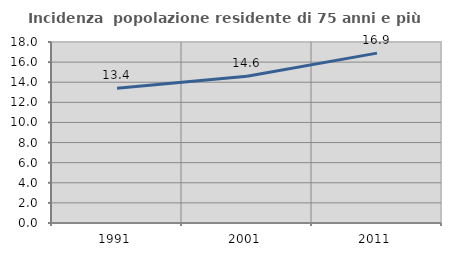
| Category | Incidenza  popolazione residente di 75 anni e più |
|---|---|
| 1991.0 | 13.39 |
| 2001.0 | 14.586 |
| 2011.0 | 16.894 |